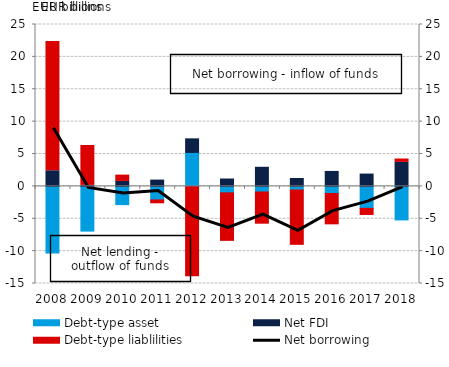
| Category | Debt-type asset | Net FDI | Debt-type liablilities |
|---|---|---|---|
| 2008.0 | -10.29 | 2.411 | 19.98 |
| 2009.0 | -6.907 | 0.153 | 6.158 |
| 2010.0 | -2.818 | 0.762 | 0.977 |
| 2011.0 | -2.093 | 0.972 | -0.595 |
| 2012.0 | 5.246 | 2.095 | -13.959 |
| 2013.0 | -1.003 | 1.138 | -7.489 |
| 2014.0 | -0.87 | 2.948 | -4.971 |
| 2015.0 | -0.567 | 1.213 | -8.537 |
| 2016.0 | -1.102 | 2.307 | -4.84 |
| 2017.0 | -3.398 | 1.901 | -1.095 |
| 2018.0 | -5.18 | 3.702 | 0.524 |